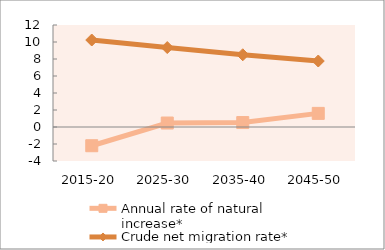
| Category | Annual rate of natural increase* | Crude net migration rate* |
|---|---|---|
| 2015-20 | -2.204 | 10.234 |
| 2025-30 | 0.467 | 9.349 |
| 2035-40 | 0.523 | 8.499 |
| 2045-50 | 1.602 | 7.763 |